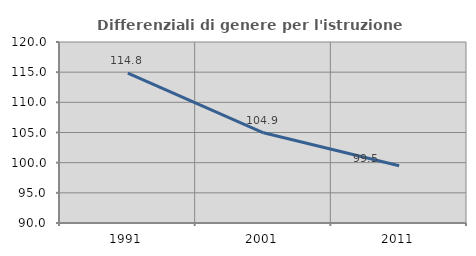
| Category | Differenziali di genere per l'istruzione superiore |
|---|---|
| 1991.0 | 114.842 |
| 2001.0 | 104.947 |
| 2011.0 | 99.478 |